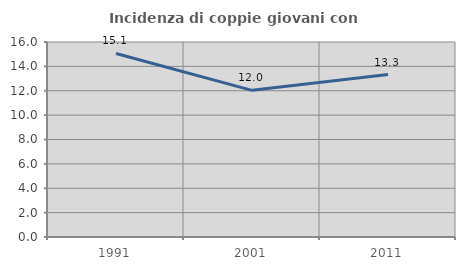
| Category | Incidenza di coppie giovani con figli |
|---|---|
| 1991.0 | 15.058 |
| 2001.0 | 12.033 |
| 2011.0 | 13.333 |